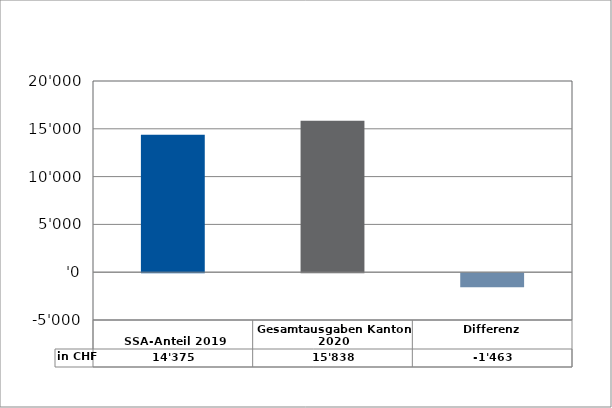
| Category | in CHF |
|---|---|
| 
SSA-Anteil 2019

 | 14375 |
| Gesamtausgaben Kanton 2020
 | 15838 |
| Differenz | -1463 |